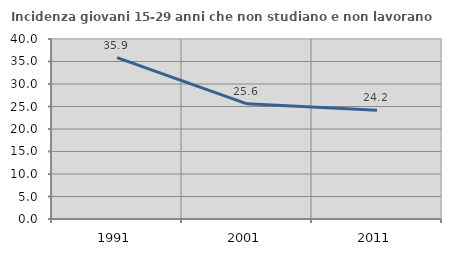
| Category | Incidenza giovani 15-29 anni che non studiano e non lavorano  |
|---|---|
| 1991.0 | 35.872 |
| 2001.0 | 25.6 |
| 2011.0 | 24.194 |